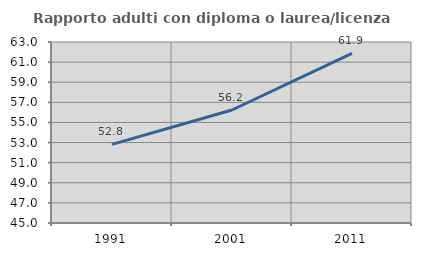
| Category | Rapporto adulti con diploma o laurea/licenza media  |
|---|---|
| 1991.0 | 52.817 |
| 2001.0 | 56.236 |
| 2011.0 | 61.864 |